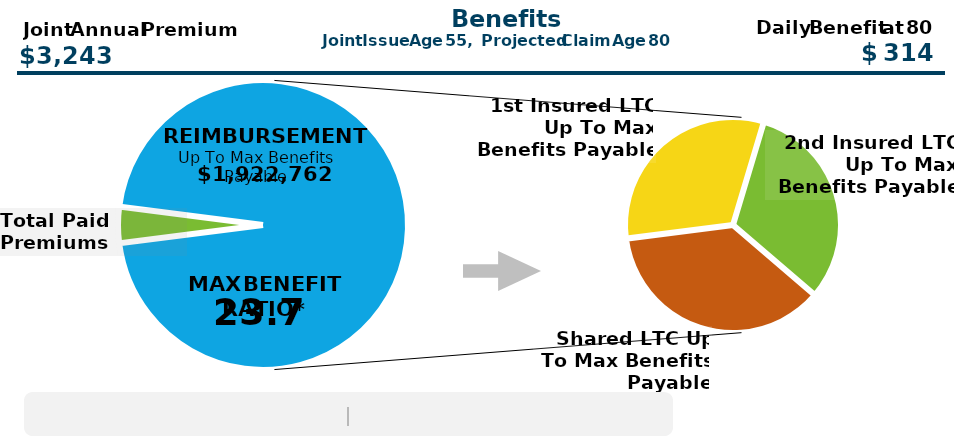
| Category | Series 0 |
|---|---|
| Total Paid Premiums | 81073 |
| 1st Insured LTC Up To Max Benefits Payable | 608608.3 |
| 2nd Insured LTC Up To Max Benefits Payable | 608608.3 |
| Shared LTC Up To Max Benefits Payable | 705545 |